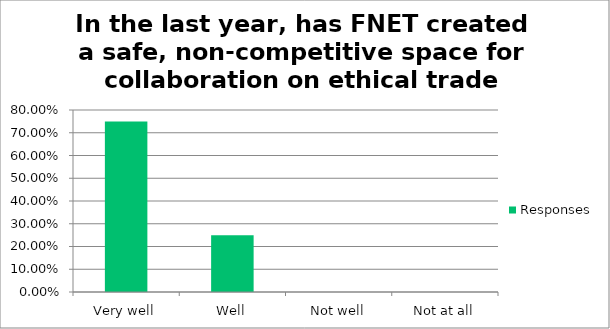
| Category | Responses |
|---|---|
| Very well | 0.75 |
| Well | 0.25 |
| Not well | 0 |
| Not at all | 0 |